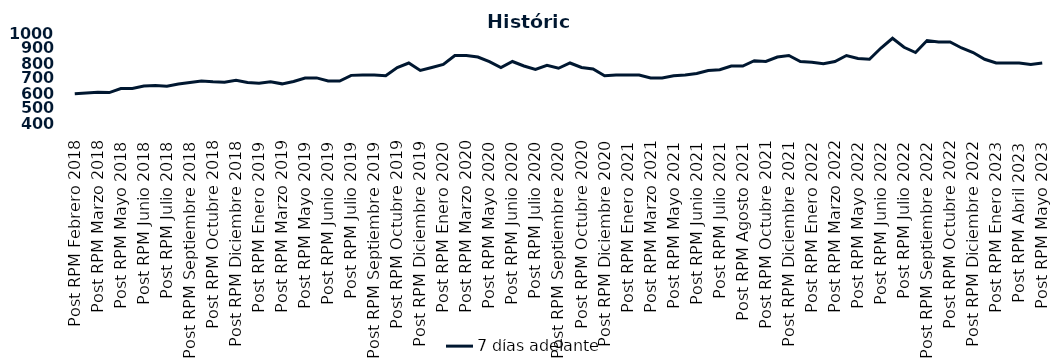
| Category | 7 días adelante  |
|---|---|
| Post RPM Febrero 2018 | 595 |
| Pre RPM Marzo 2018 | 600 |
| Post RPM Marzo 2018 | 605 |
| Pre RPM Mayo 2018 | 603 |
| Post RPM Mayo 2018 | 630 |
| Pre RPM Junio 2018 | 630 |
| Post RPM Junio 2018 | 646.5 |
| Pre RPM Julio 2018 | 650 |
| Post RPM Julio 2018 | 645 |
| Pre RPM Septiembre 2018 | 660 |
| Post RPM Septiembre 2018 | 670 |
| Pre RPM Octubre 2018 | 680 |
| Post RPM Octubre 2018 | 675 |
| Pre RPM Diciembre 2018 | 672.5 |
| Post RPM Diciembre 2018 | 685 |
| Pre RPM Enero 2019 | 670 |
| Post RPM Enero 2019 | 665 |
| Pre RPM Marzo 2019 | 675 |
| Post RPM Marzo 2019 | 661 |
| Pre RPM Mayo 2019 | 677 |
| Post RPM Mayo 2019 | 700 |
| Pre RPM Junio 2019 | 700.5 |
| Post RPM Junio 2019 | 680 |
| Pre RPM Julio 2019 | 680 |
| Post RPM Julio 2019 | 717.5 |
| Pre RPM Septiembre 2019 | 720 |
| Post RPM Septiembre 2019 | 720 |
| Pre RPM Octubre 2019 | 715 |
| Post RPM Octubre 2019 | 770 |
| Pre RPM Diciembre 2019 | 800 |
| Post RPM Diciembre 2019 | 750 |
| Pre RPM Enero 2020 | 770 |
| Post RPM Enero 2020 | 790 |
| Pre RPM Marzo 2020 | 850 |
| Post RPM Marzo 2020 | 850 |
| Pre RPM Mayo 2020 | 840 |
| Post RPM Mayo 2020 | 808.5 |
| Pre RPM Junio 2020 | 770 |
| Post RPM Junio 2020 | 810 |
| Pre RPM Julio 2020 | 780 |
| Post RPM Julio 2020 | 757 |
| Pre RPM Septiembre 2020 | 785 |
| Post RPM Septiembre 2020 | 765 |
| Pre RPM Octubre 2020 | 800 |
| Post RPM Octubre 2020 | 770 |
| Pre RPM Diciembre 2020 | 760 |
| Post RPM Diciembre 2020 | 715 |
| Pre RPM Enero 2021 | 720 |
| Post RPM Enero 2021 | 720 |
| Pre RPM Marzo 2021 | 720 |
| Post RPM Marzo 2021 | 700 |
| Pre RPM Mayo 2021 | 700 |
| Post RPM Mayo 2021 | 715 |
| Pre RPM Junio 2021 | 720 |
| Post RPM Junio 2021 | 730 |
| Pre RPM Julio 2021 | 750 |
| Post RPM Julio 2021 | 755 |
| Pre RPM Agosto 2021 | 780 |
| Post RPM Agosto 2021 | 780 |
| Pre RPM Octubre 2021 | 815 |
| Post RPM Octubre 2021 | 810 |
| Pre RPM Diciembre 2021 | 840 |
| Post RPM Diciembre 2021 | 850 |
| Pre RPM Enero 2022 | 810 |
| Post RPM Enero 2022 | 805 |
| Pre RPM Marzo 2022 | 795 |
| Post RPM Marzo 2022 | 810 |
| Pre RPM Mayo 2022 | 850 |
| Post RPM Mayo 2022 | 830 |
| Pre RPM Junio 2022 | 825 |
| Post RPM Junio 2022 | 900 |
| Pre RPM Julio 2022 | 965 |
| Post RPM Julio 2022 | 905 |
| Pre RPM Septiembre 2022 | 870 |
| Post RPM Septiembre 2022 | 950 |
| Pre RPM Octubre 2022 | 940 |
| Post RPM Octubre 2022 | 940 |
| Pre RPM Diciembre 2022 | 900 |
| Post RPM Diciembre 2022 | 870 |
| Pre RPM Enero 2023 | 825 |
| Post RPM Enero 2023 | 800 |
| Pre RPM Abril 2023 | 800 |
| Post RPM Abril 2023 | 800 |
| Pre RPM Mayo 2023 | 790 |
| Post RPM Mayo 2023 | 800 |